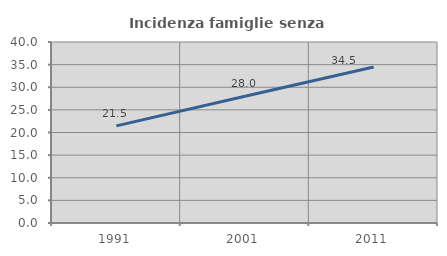
| Category | Incidenza famiglie senza nuclei |
|---|---|
| 1991.0 | 21.472 |
| 2001.0 | 28.009 |
| 2011.0 | 34.468 |